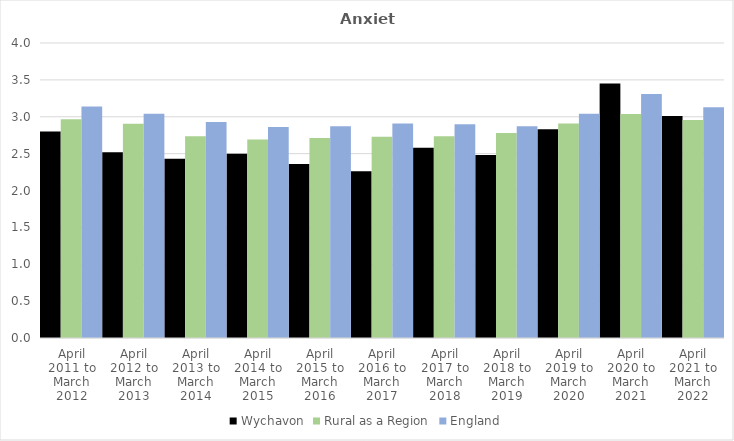
| Category | Wychavon | Rural as a Region | England |
|---|---|---|---|
| April 2011 to March 2012 | 2.8 | 2.967 | 3.14 |
| April 2012 to March 2013 | 2.52 | 2.904 | 3.04 |
| April 2013 to March 2014 | 2.43 | 2.734 | 2.93 |
| April 2014 to March 2015 | 2.5 | 2.691 | 2.86 |
| April 2015 to March 2016 | 2.36 | 2.711 | 2.87 |
| April 2016 to March 2017 | 2.26 | 2.729 | 2.91 |
| April 2017 to March 2018 | 2.58 | 2.736 | 2.9 |
| April 2018 to March 2019 | 2.48 | 2.78 | 2.87 |
| April 2019 to March 2020 | 2.83 | 2.908 | 3.04 |
| April 2020 to March 2021 | 3.45 | 3.036 | 3.31 |
| April 2021 to March 2022 | 3.01 | 2.956 | 3.13 |